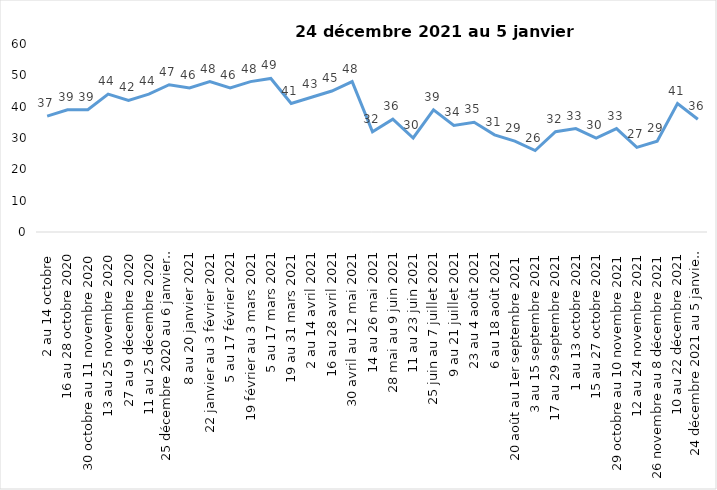
| Category | Toujours aux trois mesures |
|---|---|
| 2 au 14 octobre  | 37 |
| 16 au 28 octobre 2020 | 39 |
| 30 octobre au 11 novembre 2020 | 39 |
| 13 au 25 novembre 2020 | 44 |
| 27 au 9 décembre 2020 | 42 |
| 11 au 25 décembre 2020 | 44 |
| 25 décembre 2020 au 6 janvier  2021 | 47 |
| 8 au 20 janvier 2021 | 46 |
| 22 janvier au 3 février 2021 | 48 |
| 5 au 17 février 2021 | 46 |
| 19 février au 3 mars 2021 | 48 |
| 5 au 17 mars 2021 | 49 |
| 19 au 31 mars 2021 | 41 |
| 2 au 14 avril 2021 | 43 |
| 16 au 28 avril 2021 | 45 |
| 30 avril au 12 mai 2021 | 48 |
| 14 au 26 mai 2021 | 32 |
| 28 mai au 9 juin 2021 | 36 |
| 11 au 23 juin 2021 | 30 |
| 25 juin au 7 juillet 2021 | 39 |
| 9 au 21 juillet 2021 | 34 |
| 23 au 4 août 2021 | 35 |
| 6 au 18 août 2021 | 31 |
| 20 août au 1er septembre 2021 | 29 |
| 3 au 15 septembre 2021 | 26 |
| 17 au 29 septembre 2021 | 32 |
| 1 au 13 octobre 2021 | 33 |
| 15 au 27 octobre 2021 | 30 |
| 29 octobre au 10 novembre 2021 | 33 |
| 12 au 24 novembre 2021 | 27 |
| 26 novembre au 8 décembre 2021 | 29 |
| 10 au 22 décembre 2021 | 41 |
| 24 décembre 2021 au 5 janvier 2022 | 36 |